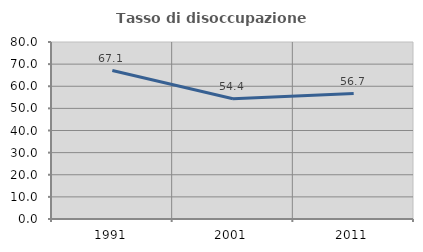
| Category | Tasso di disoccupazione giovanile  |
|---|---|
| 1991.0 | 67.117 |
| 2001.0 | 54.386 |
| 2011.0 | 56.723 |